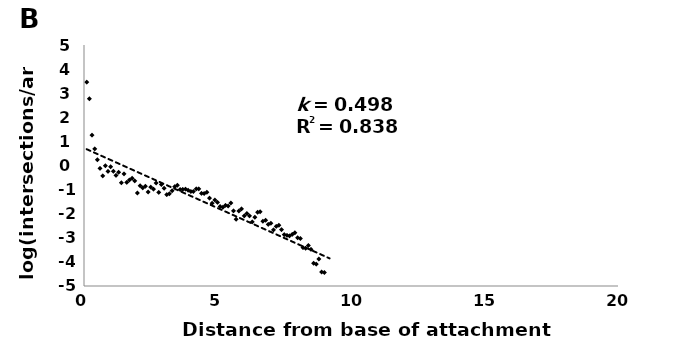
| Category | Untreated |
|---|---|
| 0.1 | 3.46 |
| 0.2 | 2.77 |
| 0.3 | 1.26 |
| 0.4 | 0.69 |
| 0.5 | 0.24 |
| 0.6 | -0.12 |
| 0.7 | -0.43 |
| 0.8 | -0.01 |
| 0.9 | -0.24 |
| 1.0 | -0.05 |
| 1.1 | -0.24 |
| 1.2 | -0.41 |
| 1.3 | -0.28 |
| 1.4 | -0.72 |
| 1.5 | -0.35 |
| 1.6 | -0.7 |
| 1.7 | -0.6 |
| 1.8 | -0.53 |
| 1.9 | -0.64 |
| 2.0 | -1.14 |
| 2.1 | -0.84 |
| 2.2 | -0.93 |
| 2.3 | -0.86 |
| 2.4 | -1.1 |
| 2.5 | -0.9 |
| 2.6 | -0.98 |
| 2.7 | -0.73 |
| 2.8 | -1.12 |
| 2.9 | -0.79 |
| 3.0 | -0.94 |
| 3.1 | -1.21 |
| 3.2 | -1.17 |
| 3.3 | -1.05 |
| 3.4 | -0.88 |
| 3.5 | -0.82 |
| 3.6 | -1 |
| 3.7 | -0.99 |
| 3.8 | -0.98 |
| 3.9 | -1.03 |
| 4.0 | -1.08 |
| 4.1 | -1.08 |
| 4.2 | -0.97 |
| 4.3 | -0.97 |
| 4.4 | -1.16 |
| 4.5 | -1.16 |
| 4.6 | -1.11 |
| 4.7 | -1.35 |
| 4.8 | -1.57 |
| 4.9 | -1.43 |
| 5.0 | -1.53 |
| 5.1 | -1.7 |
| 5.2 | -1.73 |
| 5.3 | -1.65 |
| 5.4 | -1.68 |
| 5.5 | -1.56 |
| 5.6 | -1.88 |
| 5.7 | -2.23 |
| 5.8 | -1.89 |
| 5.9 | -1.8 |
| 6.0 | -2.09 |
| 6.1 | -1.99 |
| 6.2 | -2.09 |
| 6.3 | -2.34 |
| 6.4 | -2.15 |
| 6.5 | -1.94 |
| 6.6 | -1.92 |
| 6.7 | -2.31 |
| 6.8 | -2.27 |
| 6.9 | -2.44 |
| 7.0 | -2.4 |
| 7.1 | -2.67 |
| 7.2 | -2.53 |
| 7.3 | -2.48 |
| 7.4 | -2.66 |
| 7.5 | -2.87 |
| 7.6 | -2.9 |
| 7.7 | -2.92 |
| 7.8 | -2.86 |
| 7.9 | -2.79 |
| 8.0 | -3 |
| 8.1 | -3.03 |
| 8.2 | -3.41 |
| 8.3 | -3.43 |
| 8.4 | -3.32 |
| 8.5 | -3.48 |
| 8.6 | -4.06 |
| 8.7 | -4.09 |
| 8.8 | -3.88 |
| 8.9 | -4.42 |
| 9.0 | -4.44 |
| 9.1 | -5.56 |
| 9.2 | -5.58 |